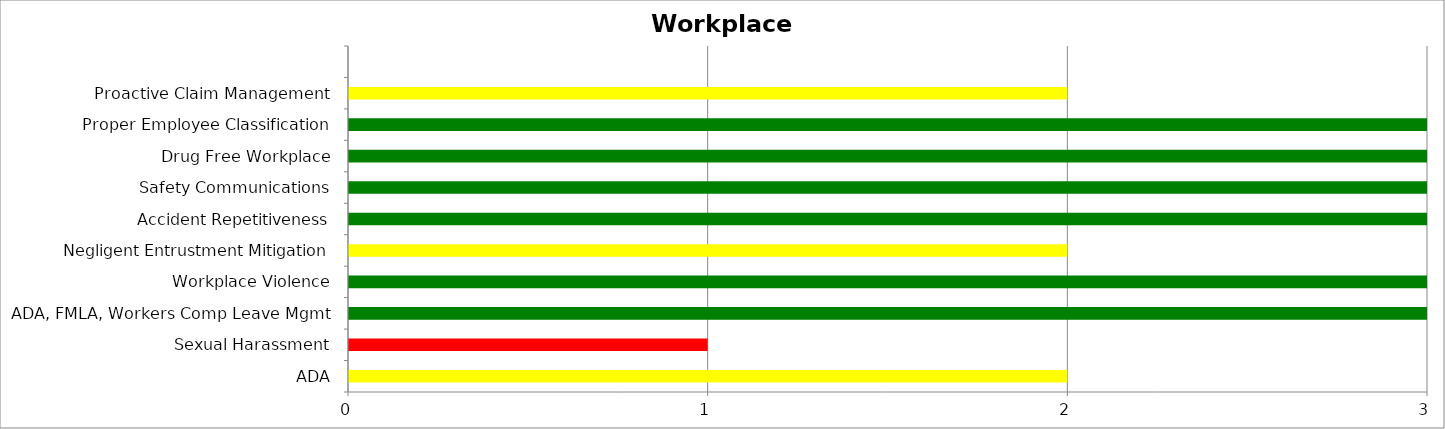
| Category | Low | Medium | High |
|---|---|---|---|
| ADA | 0 | 2 | 0 |
| Sexual Harassment | 0 | 0 | 1 |
| ADA, FMLA, Workers Comp Leave Mgmt | 3 | 0 | 0 |
| Workplace Violence | 3 | 0 | 0 |
| Negligent Entrustment Mitigation | 0 | 2 | 0 |
| Accident Repetitiveness | 3 | 0 | 0 |
| Safety Communications | 3 | 0 | 0 |
| Drug Free Workplace | 3 | 0 | 0 |
| Proper Employee Classification | 3 | 0 | 0 |
| Proactive Claim Management | 0 | 2 | 0 |